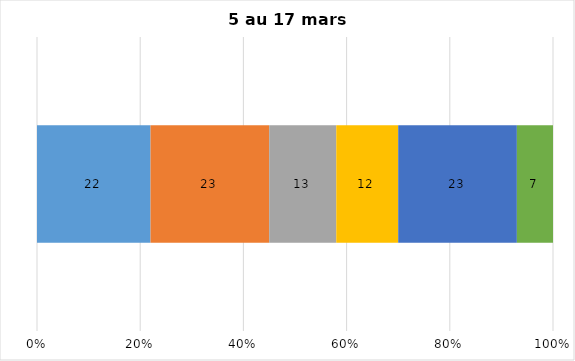
| Category | Plusieurs fois par jour | Une fois par jour | Quelques fois par semaine   | Une fois par semaine ou moins   |  Jamais   |  Je n’utilise pas les médias sociaux |
|---|---|---|---|---|---|---|
| 0 | 22 | 23 | 13 | 12 | 23 | 7 |